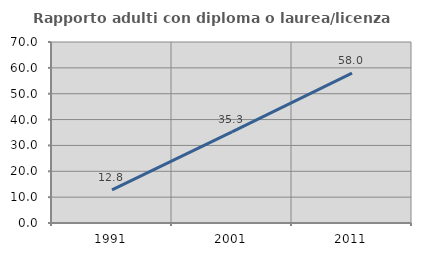
| Category | Rapporto adulti con diploma o laurea/licenza media  |
|---|---|
| 1991.0 | 12.821 |
| 2001.0 | 35.252 |
| 2011.0 | 57.971 |